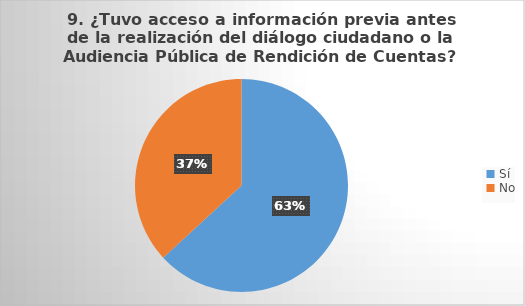
| Category | Series 0 |
|---|---|
| Sí | 12 |
| No | 7 |